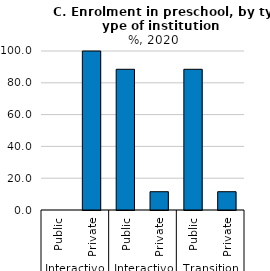
| Category | Series 0 |
|---|---|
| 0 | 0 |
| 1 | 100 |
| 2 | 88.5 |
| 3 | 11.5 |
| 4 | 88.5 |
| 5 | 11.5 |